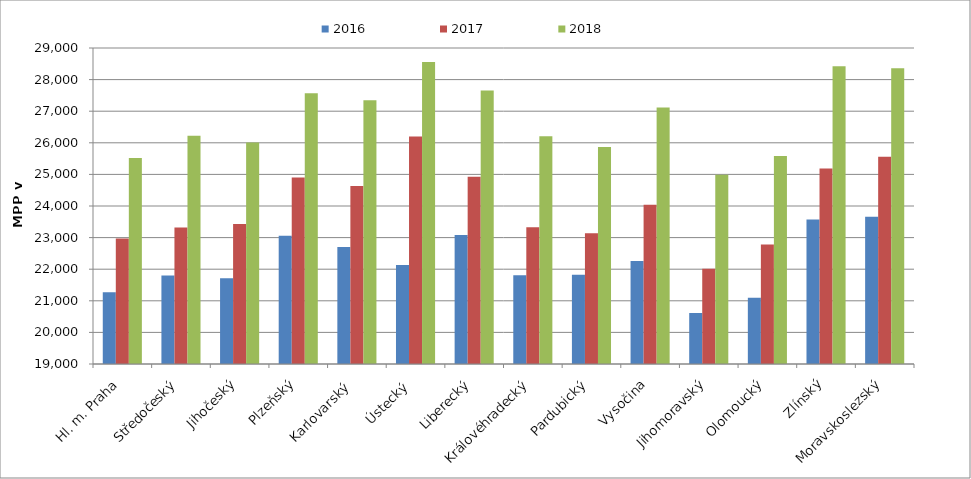
| Category | 2016 | 2017 | 2018 |
|---|---|---|---|
| Hl. m. Praha | 21267.615 | 22969.653 | 25522.711 |
| Středočeský | 21800.193 | 23321.446 | 26226.758 |
| Jihočeský | 21710.661 | 23428.682 | 26006.202 |
| Plzeňský | 23056.552 | 24901.241 | 27566.069 |
| Karlovarský  | 22704.361 | 24632.917 | 27350.427 |
| Ústecký   | 22131.874 | 26201.986 | 28559.817 |
| Liberecký | 23079.553 | 24926.894 | 27653.145 |
| Královéhradecký | 21812.451 | 23330.739 | 26205.447 |
| Pardubický | 21821.265 | 23135.935 | 25863.795 |
| Vysočina | 22257.001 | 24037.786 | 27114.565 |
| Jihomoravský | 20614.87 | 22017.844 | 24987.361 |
| Olomoucký | 21093.668 | 22781.191 | 25582.947 |
| Zlínský | 23569.536 | 25184.468 | 28419.864 |
| Moravskoslezský | 23661.266 | 25559.097 | 28360.656 |